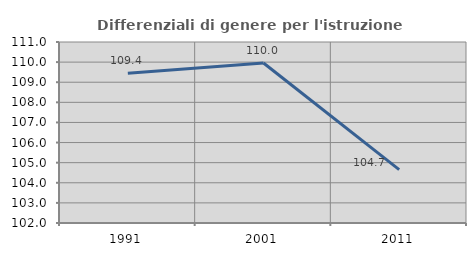
| Category | Differenziali di genere per l'istruzione superiore |
|---|---|
| 1991.0 | 109.443 |
| 2001.0 | 109.957 |
| 2011.0 | 104.657 |